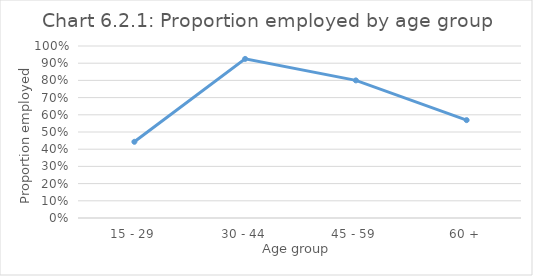
| Category | Weighted % employed |
|---|---|
| 15 - 29 | 0.443 |
| 30 - 44 | 0.925 |
| 45 - 59 | 0.8 |
| 60 + | 0.569 |